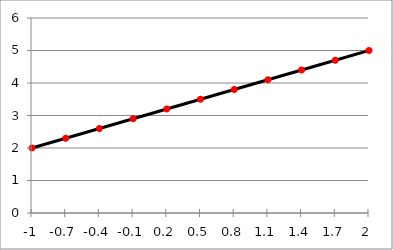
| Category | Series 0 |
|---|---|
| -1.0 | 2 |
| -0.7 | 2.3 |
| -0.39999999999999997 | 2.6 |
| -0.09999999999999998 | 2.9 |
| 0.2 | 3.2 |
| 0.5 | 3.5 |
| 0.8 | 3.8 |
| 1.1 | 4.1 |
| 1.4000000000000001 | 4.4 |
| 1.7000000000000002 | 4.7 |
| 2.0 | 5 |